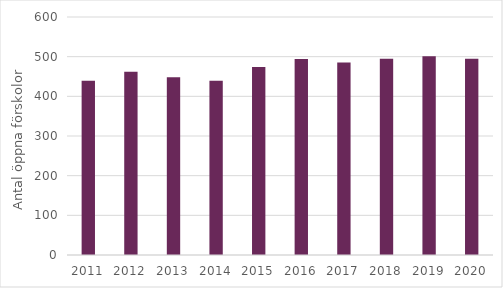
| Category | Antal öppna förskolor |
|---|---|
| 2011.0 | 439 |
| 2012.0 | 462 |
| 2013.0 | 448 |
| 2014.0 | 439 |
| 2015.0 | 474 |
| 2016.0 | 494 |
| 2017.0 | 485 |
| 2018.0 | 495 |
| 2019.0 | 501 |
| 2020.0 | 495 |